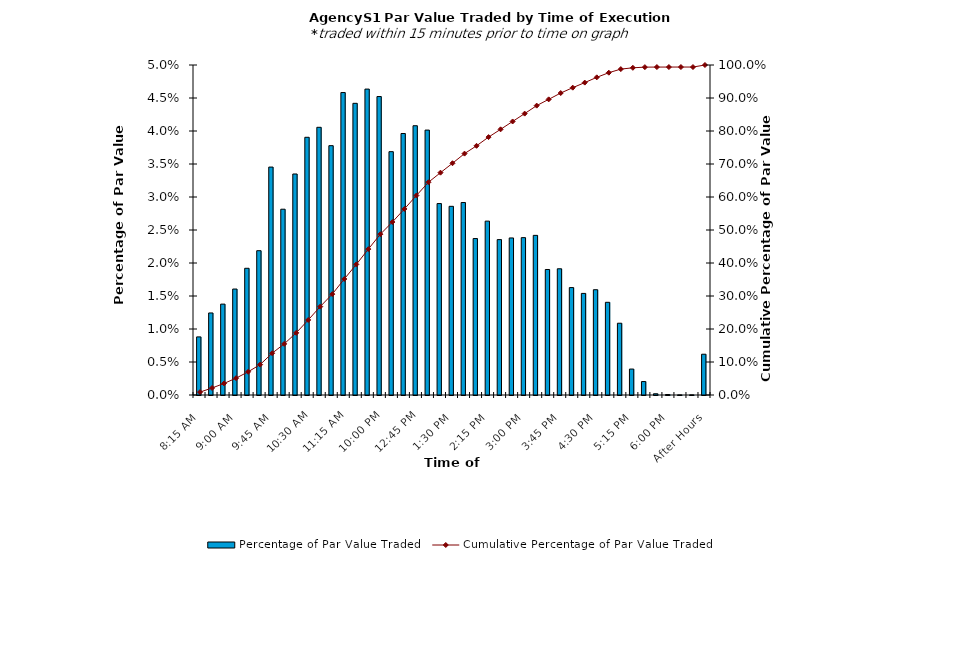
| Category | Percentage of Par Value Traded |
|---|---|
| 8:15 AM | 0.009 |
| 8:30 AM | 0.012 |
| 8:45 AM | 0.014 |
| 9:00 AM | 0.016 |
| 9:15 AM | 0.019 |
| 9:30 AM | 0.022 |
| 9:45 AM | 0.035 |
| 10:00 AM | 0.028 |
| 10:15 AM | 0.033 |
| 10:30 AM | 0.039 |
| 10:45 AM | 0.041 |
| 11:00 AM | 0.038 |
| 11:15 AM | 0.046 |
| 11:30 AM | 0.044 |
| 11:45 AM | 0.046 |
| 12:00 PM | 0.045 |
| 12:15 PM | 0.037 |
| 12:30 PM | 0.04 |
| 12:45 PM | 0.041 |
| 1:00 PM | 0.04 |
| 1:15 PM | 0.029 |
| 1:30 PM | 0.029 |
| 1:45 PM | 0.029 |
| 2:00 PM | 0.024 |
| 2:15 PM | 0.026 |
| 2:30 PM | 0.024 |
| 2:45 PM | 0.024 |
| 3:00 PM | 0.024 |
| 3:15 PM | 0.024 |
| 3:30 PM | 0.019 |
| 3:45 PM | 0.019 |
| 4:00 PM | 0.016 |
| 4:15 PM | 0.015 |
| 4:30 PM | 0.016 |
| 4:45 PM | 0.014 |
| 5:00 PM | 0.011 |
| 5:15 PM | 0.004 |
| 5:30 PM | 0.002 |
| 5:45 PM | 0 |
| 6:00 PM | 0 |
| 6:15 PM | 0 |
| 6:30 PM | 0 |
| After Hours | 0.006 |